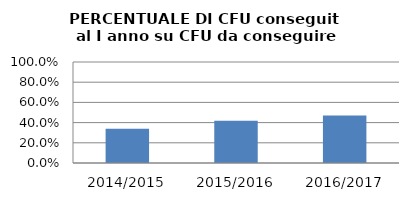
| Category | 2014/2015 2015/2016 2016/2017 |
|---|---|
| 2014/2015 | 0.339 |
| 2015/2016 | 0.418 |
| 2016/2017 | 0.472 |